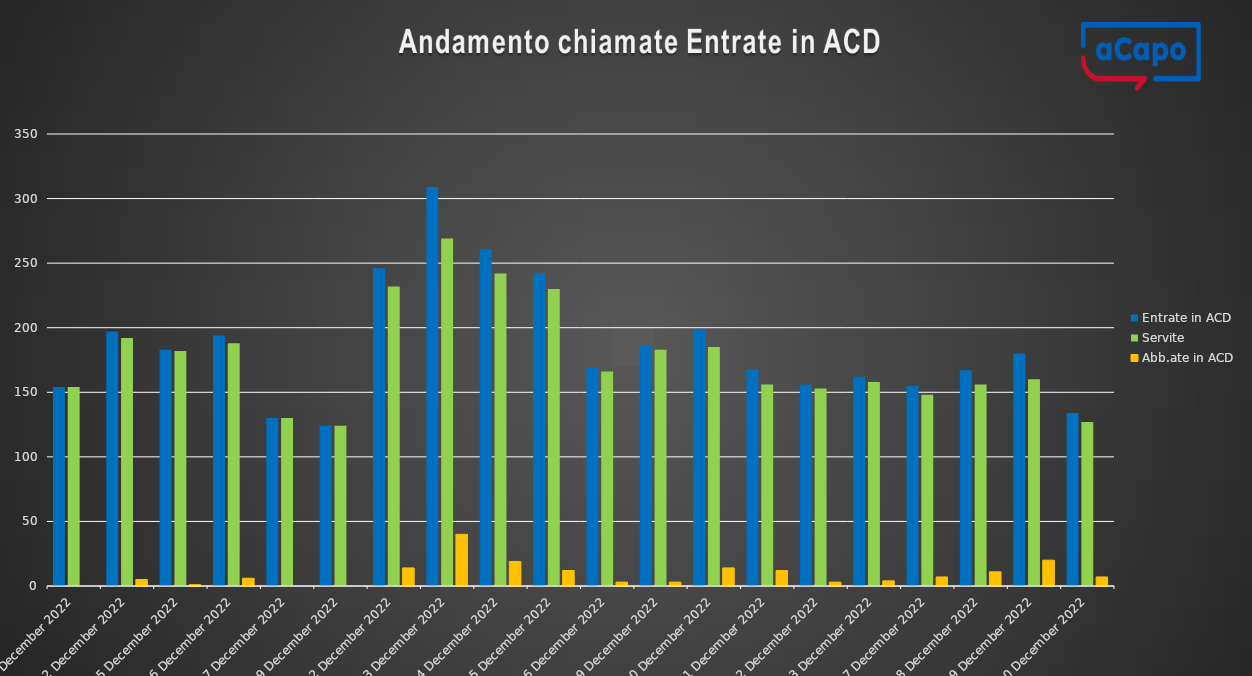
| Category | Entrate in ACD | Servite | Abb.ate in ACD |
|---|---|---|---|
| 2022-12-01 | 154 | 154 | 0 |
| 2022-12-02 | 197 | 192 | 5 |
| 2022-12-05 | 183 | 182 | 1 |
| 2022-12-06 | 194 | 188 | 6 |
| 2022-12-07 | 130 | 130 | 0 |
| 2022-12-09 | 124 | 124 | 0 |
| 2022-12-12 | 246 | 232 | 14 |
| 2022-12-13 | 309 | 269 | 40 |
| 2022-12-14 | 261 | 242 | 19 |
| 2022-12-15 | 242 | 230 | 12 |
| 2022-12-16 | 169 | 166 | 3 |
| 2022-12-19 | 186 | 183 | 3 |
| 2022-12-20 | 199 | 185 | 14 |
| 2022-12-21 | 168 | 156 | 12 |
| 2022-12-22 | 156 | 153 | 3 |
| 2022-12-23 | 162 | 158 | 4 |
| 2022-12-27 | 155 | 148 | 7 |
| 2022-12-28 | 167 | 156 | 11 |
| 2022-12-29 | 180 | 160 | 20 |
| 2022-12-30 | 134 | 127 | 7 |